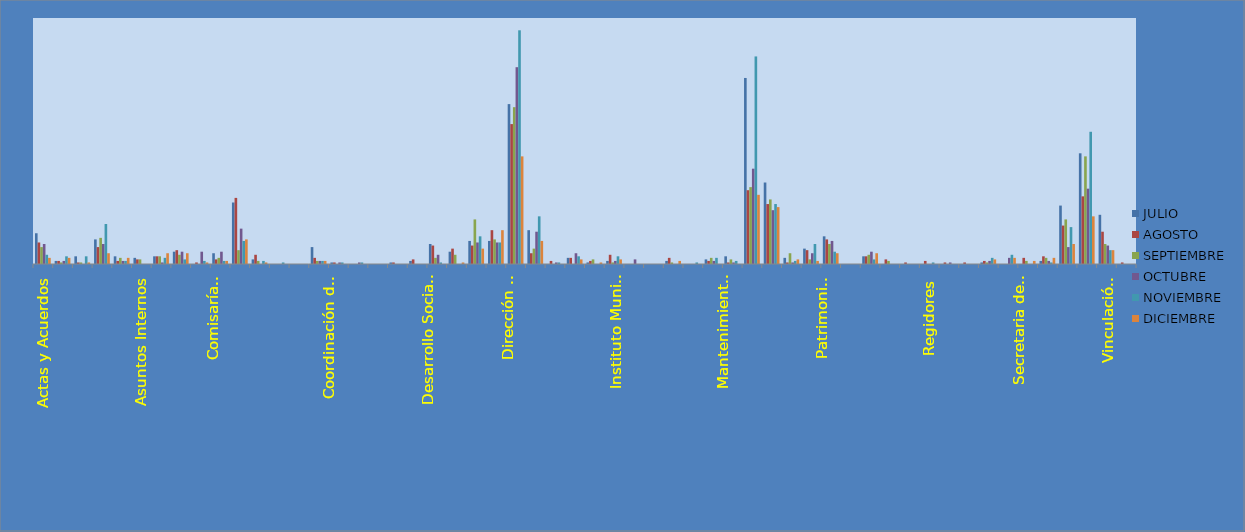
| Category | JULIO | AGOSTO | SEPTIEMBRE | OCTUBRE | NOVIEMBRE | DICIEMBRE |
|---|---|---|---|---|---|---|
| Actas y Acuerdos | 20 | 14 | 11 | 13 | 6 | 4 |
| Agua y Alcantarillado | 2 | 2 | 1 | 2 | 5 | 4 |
| Alumbrado Público | 5 | 1 | 1 | 0 | 5 | 1 |
| Archivo Municipal | 16 | 11 | 17 | 13 | 26 | 7 |
| Aseo Público | 5 | 2 | 4 | 2 | 2 | 4 |
| Asuntos Internos | 4 | 3 | 3 | 0 | 0 | 0 |
| Atención Ciudadana | 5 | 5 | 5 | 1 | 4 | 7 |
| Catastro | 8 | 9 | 6 | 8 | 3 | 7 |
| Cementerios | 0 | 1 | 0 | 8 | 2 | 1 |
| Centro de  Promoción Económica y Turismo | 7 | 3 | 4 | 8 | 2 | 2 |
| Comisaría General de Seguridad Pública | 40 | 43 | 9 | 23 | 15 | 16 |
| Comunicación Social | 3 | 6 | 2 | 0 | 2 | 1 |
| Comunidad Digna | 0 | 0 | 0 | 0 | 1 | 0 |
| Consejería Juridica | 0 | 0 | 0 | 0 | 0 | 0 |
| Contraloría | 11 | 4 | 2 | 2 | 2 | 2 |
| Coordinación de Delegaciones | 1 | 1 | 0 | 1 | 1 | 0 |
| Coordinación de Gabinete | 0 | 0 | 0 | 1 | 1 | 0 |
| Coordinación de la Oficina de Presidencia  | 0 | 0 | 0 | 0 | 0 | 0 |
| Coordinación General  Oficina Central de Gobierno, Estrategía y opinión Pública | 1 | 1 | 0 | 0 | 0 | 0 |
| Coplademun | 2 | 3 | 0 | 0 | 0 | 0 |
| Desarrollo Social Humano | 13 | 12 | 4 | 6 | 1 | 0 |
| Dirección General de  Innovación y Tecnología | 8 | 10 | 6 | 0 | 0 | 1 |
| Dirección General de Ecología | 15 | 12 | 29 | 14 | 18 | 10 |
| Dirección General de Inspección de Reglamentos | 15 | 22 | 16 | 14 | 14 | 22 |
| Dirección General de Obras Públicas | 104 | 91 | 102 | 128 | 152 | 70 |
| Dirección General de Servicios Públicos | 22 | 7 | 10 | 21 | 31 | 15 |
| Educación Municipal | 0 | 2 | 0 | 1 | 1 | 0 |
| Estacionómetros y Estacionamientos | 4 | 4 | 0 | 7 | 5 | 3 |
| Instituto de Capacitación y Oferta Educativa | 1 | 2 | 3 | 0 | 0 | 1 |
| Instituto de Cultura | 2 | 6 | 1 | 2 | 5 | 3 |
| Instituto Municipal de la Juventud | 0 | 0 | 0 | 3 | 0 | 0 |
| Instituto Municipal de la Mujer | 0 | 0 | 0 | 0 | 0 | 0 |
| Integración y Dictaminación | 2 | 4 | 1 | 0 | 0 | 2 |
| Junta Municipal de Reclutamiento | 0 | 0 | 0 | 0 | 1 | 0 |
| Mantenimiento de Pavimentos | 3 | 2 | 4 | 2 | 4 | 0 |
| Mantenimiento Urbano | 5 | 1 | 3 | 1 | 2 | 0 |
| Oficialía Mayor Administrativa | 121 | 48 | 50 | 62 | 135 | 45 |
| Oficialía Mayor de Padrón y Licencias | 53 | 39 | 42 | 35 | 39 | 37 |
| Parques y Jardines | 4 | 1 | 7 | 1 | 2 | 3 |
| Participación Ciudadana | 10 | 9 | 3 | 7 | 13 | 2 |
| Patrimonio Municipal | 18 | 16 | 13 | 15 | 8 | 7 |
| Protección al Medio Ambiente | 0 | 0 | 0 | 0 | 0 | 0 |
| Protección Civil y Bomberos | 5 | 5 | 6 | 8 | 3 | 7 |
| Proyectos Estratégicos | 0 | 3 | 2 | 0 | 0 | 0 |
| Rastros Municipales | 0 | 1 | 0 | 0 | 0 | 0 |
| Regidores | 0 | 2 | 0 | 0 | 1 | 0 |
| Registro Civil | 0 | 1 | 0 | 1 | 0 | 0 |
| Relaciones Exteriores | 0 | 1 | 0 | 0 | 0 | 0 |
| Relaciones Públicas | 1 | 2 | 1 | 2 | 4 | 3 |
| Sanidad Animal | 0 | 0 | 0 | 4 | 6 | 4 |
| Secretaria del Ayuntamiento | 0 | 4 | 2 | 0 | 0 | 2 |
| Secretaría Particular | 2 | 5 | 4 | 2 | 1 | 4 |
| Sindicatura | 38 | 25 | 29 | 11 | 24 | 13 |
| Tesorería | 72 | 44 | 70 | 49 | 86 | 31 |
| Transparencia y Acceso a la Información | 32 | 21 | 13 | 12 | 9 | 9 |
| Vinculación Asuntos Religiosos | 0 | 1 | 0 | 0 | 0 | 0 |